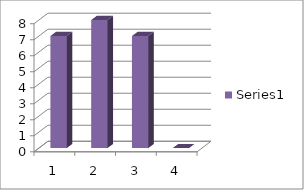
| Category | Series 0 |
|---|---|
| 0 | 7 |
| 1 | 8 |
| 2 | 7 |
| 3 | 0 |